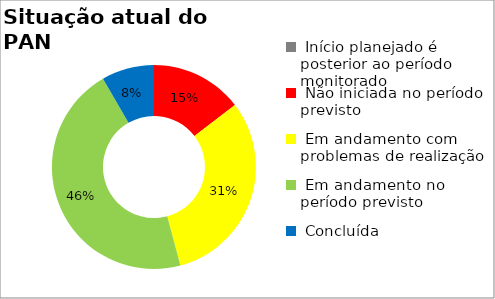
| Category | Series 0 |
|---|---|
|  Início planejado é posterior ao período monitorado | 0 |
|  Não iniciada no período previsto | 0.146 |
|  Em andamento com problemas de realização | 0.312 |
|  Em andamento no período previsto  | 0.458 |
|  Concluída | 0.083 |